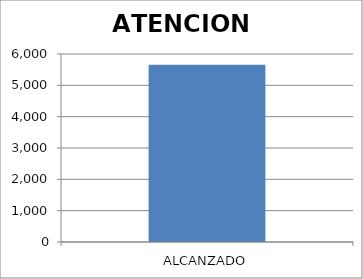
| Category | ATENCION BRINDADA |
|---|---|
| ALCANZADO | 5656 |